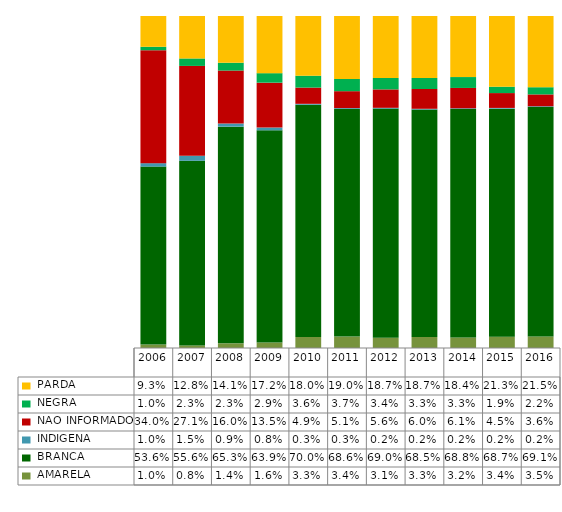
| Category |  AMARELA     |  BRANCA      |  INDIGENA    |  NAO INFORMADO  |  NEGRA       |  PARDA       |
|---|---|---|---|---|---|---|
| 2006.0 | 0.01 | 0.536 | 0.01 | 0.34 | 0.01 | 0.093 |
| 2007.0 | 0.008 | 0.556 | 0.015 | 0.271 | 0.023 | 0.128 |
| 2008.0 | 0.014 | 0.653 | 0.009 | 0.16 | 0.023 | 0.141 |
| 2009.0 | 0.016 | 0.639 | 0.008 | 0.135 | 0.029 | 0.172 |
| 2010.0 | 0.033 | 0.7 | 0.003 | 0.049 | 0.036 | 0.18 |
| 2011.0 | 0.034 | 0.686 | 0.003 | 0.051 | 0.037 | 0.19 |
| 2012.0 | 0.031 | 0.69 | 0.002 | 0.056 | 0.034 | 0.187 |
| 2013.0 | 0.033 | 0.685 | 0.002 | 0.06 | 0.033 | 0.187 |
| 2014.0 | 0.032 | 0.688 | 0.002 | 0.061 | 0.033 | 0.184 |
| 2015.0 | 0.034 | 0.687 | 0.002 | 0.045 | 0.019 | 0.213 |
| 2016.0 | 0.035 | 0.691 | 0.002 | 0.036 | 0.022 | 0.215 |